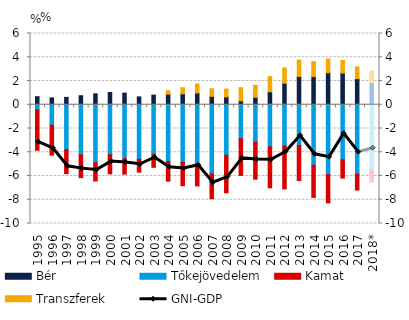
| Category | Bér | Tőkejövedelem | Kamat | Transzferek |
|---|---|---|---|---|
| 1995 | 0.68 | -0.426 | -3.405 | 0 |
| 1996 | 0.576 | -1.727 | -2.513 | 0 |
| 1997 | 0.62 | -3.785 | -2.015 | 0 |
| 1998 | 0.76 | -4.21 | -1.93 | 0 |
| 1999 | 0.919 | -4.893 | -1.526 | 0 |
| 2000 | 1.029 | -4.208 | -1.61 | 0 |
| 2001 | 0.978 | -4.543 | -1.3 | 0 |
| 2002 | 0.661 | -4.594 | -1.083 | 0 |
| 2003 | 0.811 | -4.179 | -1.091 | 0 |
| 2004 | 0.887 | -4.784 | -1.651 | 0.291 |
| 2005 | 0.921 | -4.865 | -1.951 | 0.52 |
| 2006 | 0.991 | -4.964 | -1.869 | 0.745 |
| 2007 | 0.71 | -5.808 | -2.103 | 0.639 |
| 2008 | 0.664 | -4.255 | -3.158 | 0.657 |
| 2009 | 0.329 | -2.86 | -3.091 | 1.105 |
| 2010 | 0.629 | -3.165 | -3.101 | 1.017 |
| 2011 | 1.09 | -3.545 | -3.45 | 1.277 |
| 2012 | 1.816 | -3.476 | -3.611 | 1.293 |
| 2013 | 2.381 | -3.431 | -2.945 | 1.384 |
| 2014 | 2.373 | -5.097 | -2.701 | 1.254 |
| 2015 | 2.693 | -5.885 | -2.379 | 1.162 |
| 2016 | 2.669 | -4.631 | -1.544 | 1.067 |
| 2017 | 2.203 | -5.838 | -1.343 | 0.985 |
| 2018* | 1.851 | -5.505 | -1.002 | 0.996 |